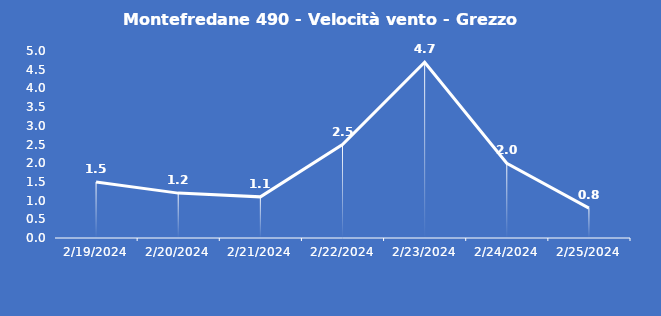
| Category | Montefredane 490 - Velocità vento - Grezzo (m/s) |
|---|---|
| 2/19/24 | 1.5 |
| 2/20/24 | 1.2 |
| 2/21/24 | 1.1 |
| 2/22/24 | 2.5 |
| 2/23/24 | 4.7 |
| 2/24/24 | 2 |
| 2/25/24 | 0.8 |